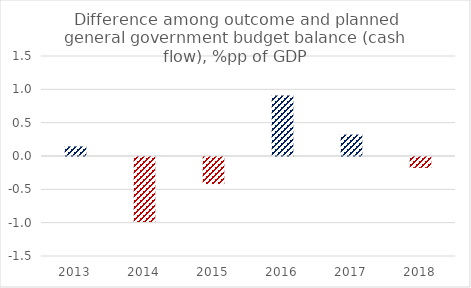
| Category | Series 0 |
|---|---|
| 2013.0 | 0.143 |
| 2014.0 | -0.975 |
| 2015.0 | -0.406 |
| 2016.0 | 0.908 |
| 2017.0 | 0.321 |
| 2018.0 | -0.164 |